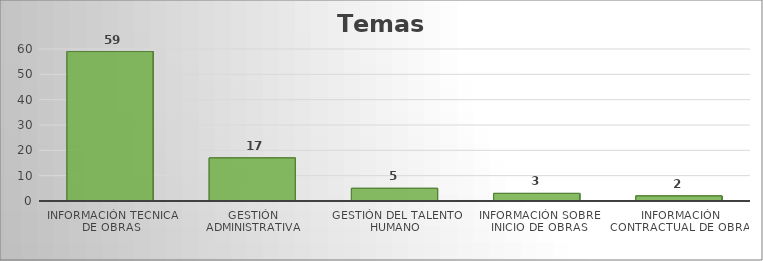
| Category | Series 0 |
|---|---|
| INFORMACIÓN TECNICA DE OBRAS | 59 |
| GESTIÓN ADMINISTRATIVA | 17 |
| GESTIÓN DEL TALENTO HUMANO | 5 |
| INFORMACIÓN SOBRE INICIO DE OBRAS | 3 |
| INFORMACIÓN CONTRACTUAL DE OBRAS | 2 |